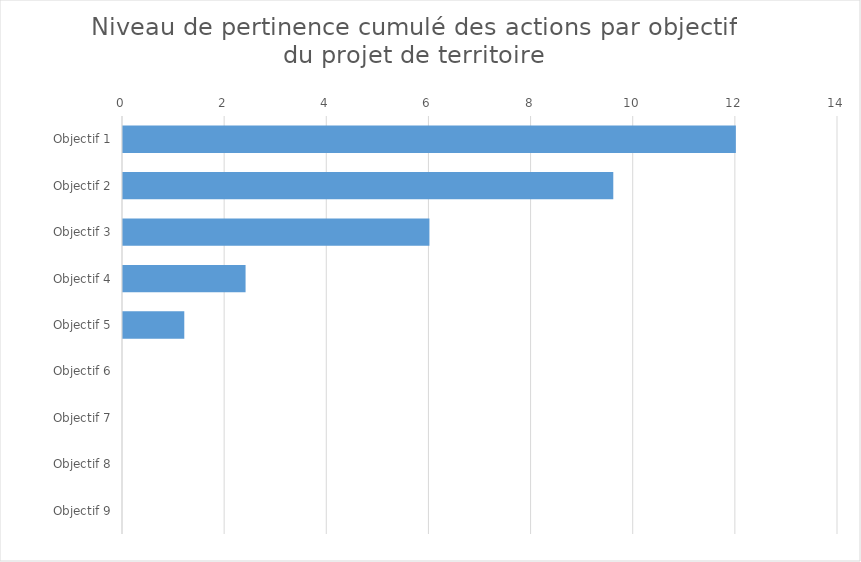
| Category | Series 0 |
|---|---|
| Objectif 1 | 12 |
| Objectif 2 | 9.6 |
| Objectif 3 | 6 |
| Objectif 4 | 2.4 |
| Objectif 5 | 1.2 |
| Objectif 6 | 0 |
| Objectif 7 | 0 |
| Objectif 8 | 0 |
| Objectif 9 | 0 |